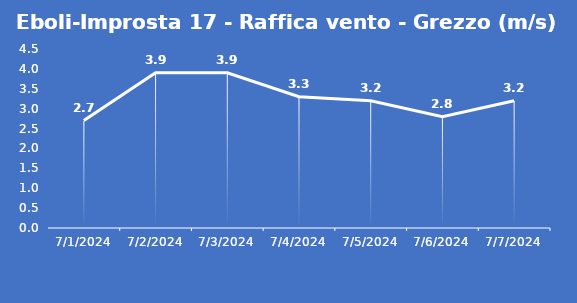
| Category | Eboli-Improsta 17 - Raffica vento - Grezzo (m/s) |
|---|---|
| 7/1/24 | 2.7 |
| 7/2/24 | 3.9 |
| 7/3/24 | 3.9 |
| 7/4/24 | 3.3 |
| 7/5/24 | 3.2 |
| 7/6/24 | 2.8 |
| 7/7/24 | 3.2 |